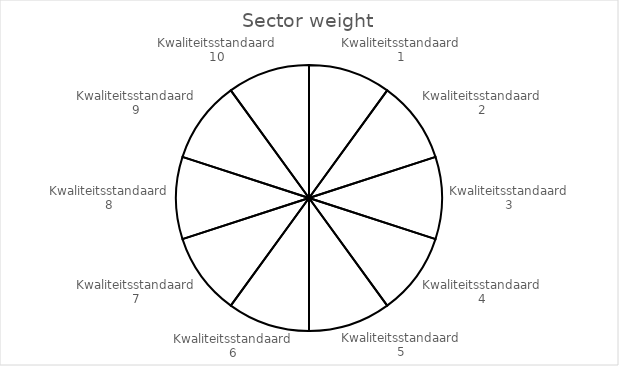
| Category | Sector weight |
|---|---|
| Kwaliteitsstandaard 1 | 1 |
| Kwaliteitsstandaard 2 | 1 |
| Kwaliteitsstandaard 3 | 1 |
| Kwaliteitsstandaard 4 | 1 |
| Kwaliteitsstandaard 5 | 1 |
| Kwaliteitsstandaard 6 | 1 |
| Kwaliteitsstandaard 7 | 1 |
| Kwaliteitsstandaard 8 | 1 |
| Kwaliteitsstandaard 9 | 1 |
| Kwaliteitsstandaard 10 | 1 |